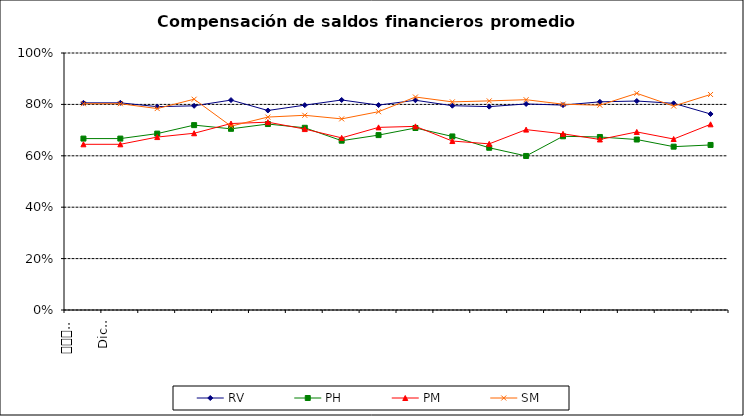
| Category | RV | PH | PM | SM |
|---|---|---|---|---|
| 0 | 0.806 | 0.667 | 0.645 | 0.803 |
| 1 | 0.806 | 0.667 | 0.645 | 0.803 |
| 2 | 0.791 | 0.686 | 0.673 | 0.784 |
| 3 | 0.794 | 0.719 | 0.688 | 0.82 |
| 4 | 0.817 | 0.705 | 0.726 | 0.715 |
| 5 | 0.776 | 0.724 | 0.731 | 0.751 |
| 6 | 0.797 | 0.709 | 0.704 | 0.758 |
| 7 | 0.817 | 0.659 | 0.67 | 0.744 |
| 8 | 0.797 | 0.681 | 0.711 | 0.772 |
| 9 | 0.816 | 0.708 | 0.715 | 0.829 |
| 10 | 0.795 | 0.675 | 0.657 | 0.81 |
| 11 | 0.791 | 0.631 | 0.646 | 0.814 |
| 12 | 0.802 | 0.599 | 0.702 | 0.818 |
| 13 | 0.797 | 0.676 | 0.686 | 0.801 |
| 14 | 0.81 | 0.673 | 0.664 | 0.797 |
| 15 | 0.813 | 0.663 | 0.693 | 0.843 |
| 16 | 0.804 | 0.636 | 0.665 | 0.794 |
| 17 | 0.763 | 0.642 | 0.722 | 0.839 |